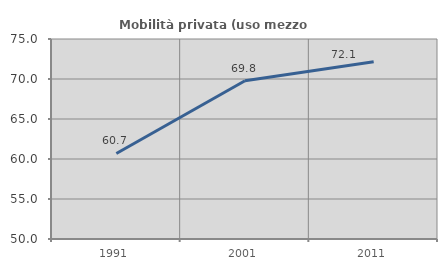
| Category | Mobilità privata (uso mezzo privato) |
|---|---|
| 1991.0 | 60.693 |
| 2001.0 | 69.786 |
| 2011.0 | 72.146 |